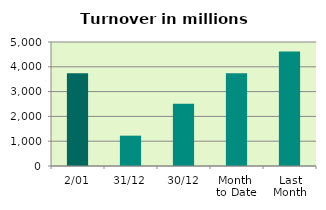
| Category | Series 0 |
|---|---|
| 2/01 | 3735.828 |
| 31/12 | 1222.873 |
| 30/12 | 2506.604 |
| Month 
to Date | 3735.828 |
| Last
Month | 4613.793 |